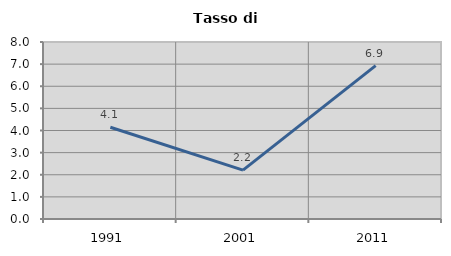
| Category | Tasso di disoccupazione   |
|---|---|
| 1991.0 | 4.147 |
| 2001.0 | 2.211 |
| 2011.0 | 6.933 |